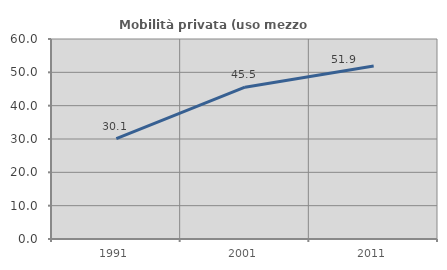
| Category | Mobilità privata (uso mezzo privato) |
|---|---|
| 1991.0 | 30.091 |
| 2001.0 | 45.54 |
| 2011.0 | 51.878 |